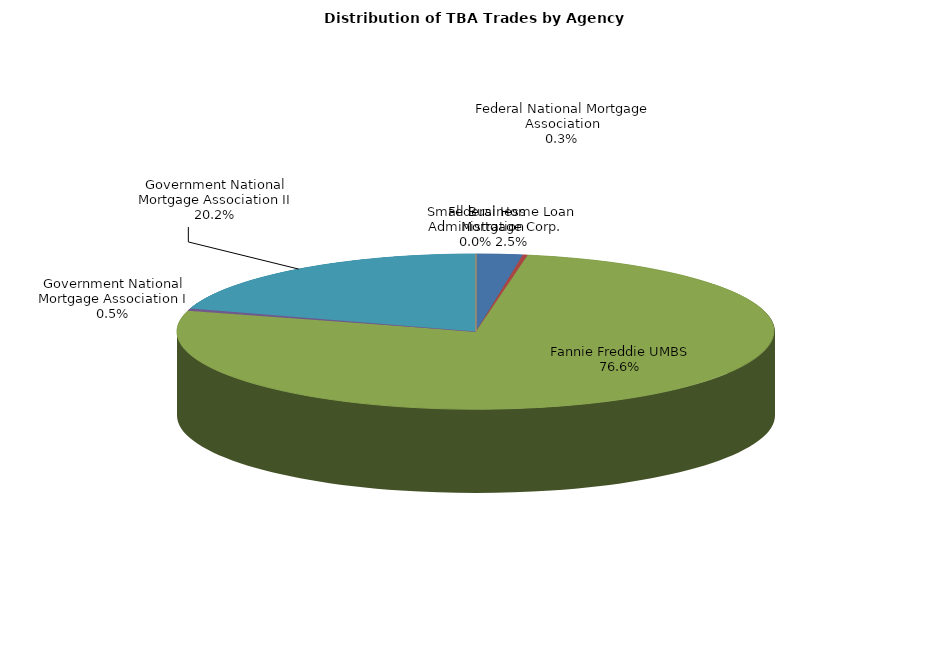
| Category | Series 0 |
|---|---|
| Federal Home Loan Mortgage Corp. | 215.73 |
| Federal National Mortgage Association | 23 |
| Fannie Freddie UMBS | 6627.155 |
| Government National Mortgage Association I | 39.31 |
| Government National Mortgage Association II | 1747.294 |
| Small Business Administration | 0 |